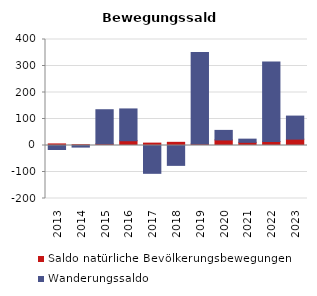
| Category | Saldo natürliche Bevölkerungsbewegungen | Wanderungssaldo |
|---|---|---|
| 2013.0 | 6 | -15 |
| 2014.0 | 3 | -6 |
| 2015.0 | 6 | 129 |
| 2016.0 | 18 | 120 |
| 2017.0 | 9 | -105 |
| 2018.0 | 12 | -75 |
| 2019.0 | 6 | 345 |
| 2020.0 | 21 | 36 |
| 2021.0 | 12 | 12 |
| 2022.0 | 15 | 300 |
| 2023.0 | 24 | 87 |